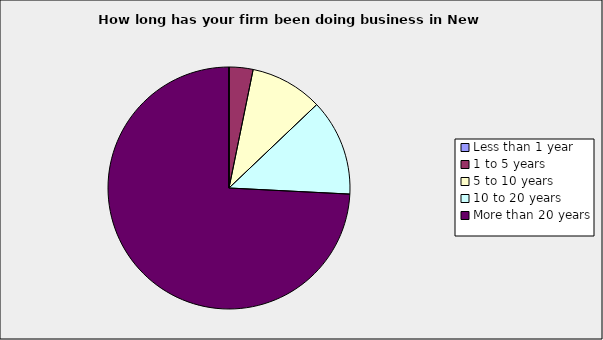
| Category | Series 0 |
|---|---|
| Less than 1 year | 0 |
| 1 to 5 years | 0.032 |
| 5 to 10 years | 0.097 |
| 10 to 20 years | 0.129 |
| More than 20 years | 0.742 |